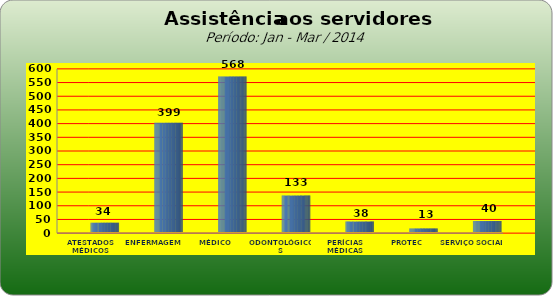
| Category | Series 0 |
|---|---|
| ATESTADOS MÉDICOS | 34 |
| ENFERMAGEM | 399 |
| MÉDICO | 568 |
| ODONTOLÓGICOS | 133 |
| PERÍCIAS MÉDICAS | 38 |
| PROTEC | 13 |
| SERVIÇO SOCIAL | 40 |